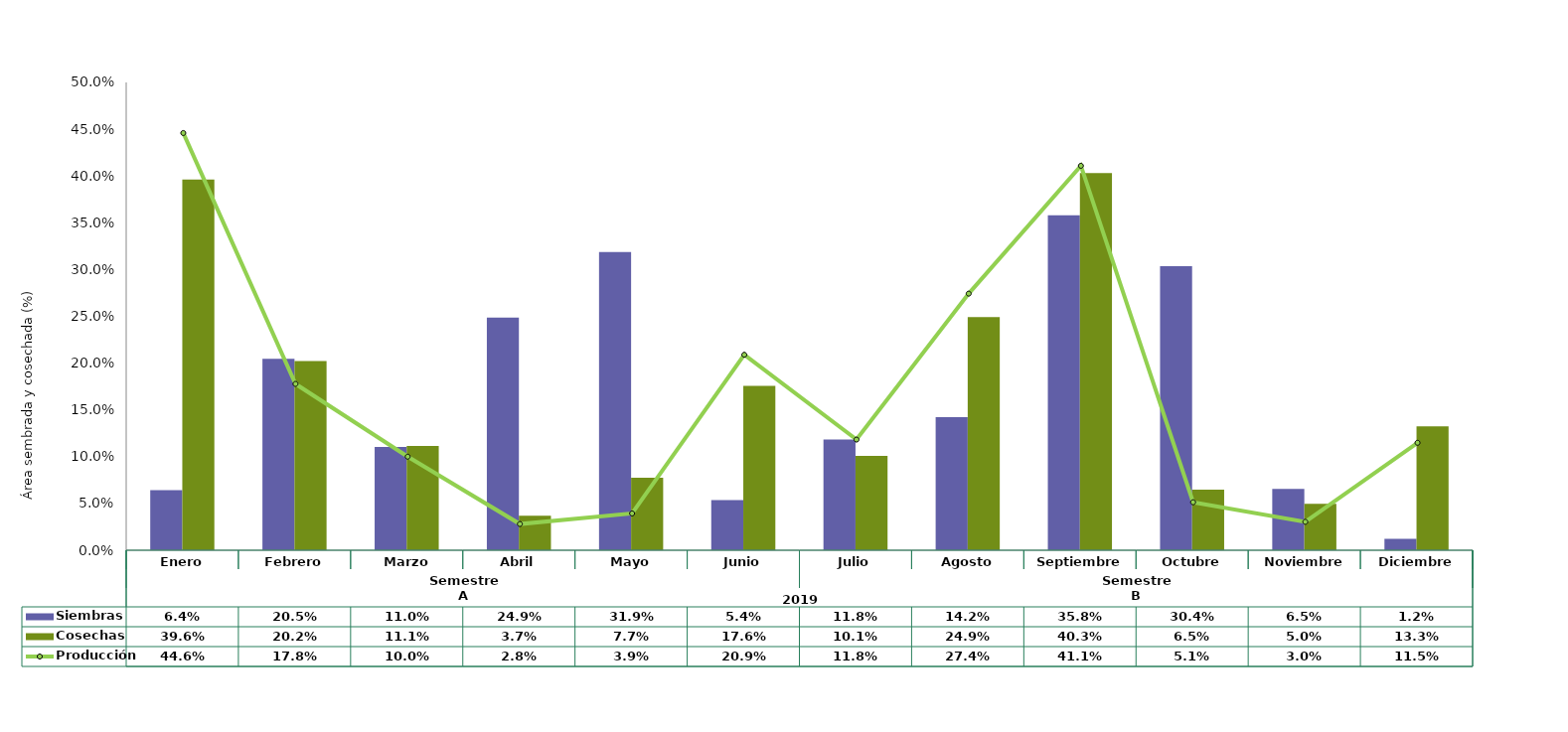
| Category | Siembras | Cosechas   |
|---|---|---|
| 0 | 0.064 | 0.396 |
| 1 | 0.205 | 0.202 |
| 2 | 0.11 | 0.111 |
| 3 | 0.249 | 0.037 |
| 4 | 0.319 | 0.077 |
| 5 | 0.054 | 0.176 |
| 6 | 0.118 | 0.101 |
| 7 | 0.142 | 0.249 |
| 8 | 0.358 | 0.403 |
| 9 | 0.304 | 0.065 |
| 10 | 0.065 | 0.05 |
| 11 | 0.012 | 0.133 |